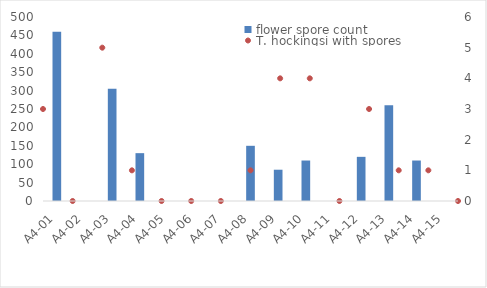
| Category | flower spore count |
|---|---|
| A4-01 | 460 |
| A4-02 | 0 |
| A4-03 | 305 |
| A4-04 | 130 |
| A4-05 | 0 |
| A4-06 | 0 |
| A4-07 | 0 |
| A4-08 | 150 |
| A4-09 | 85 |
| A4-10 | 110 |
| A4-11 | 0 |
| A4-12 | 120 |
| A4-13 | 260 |
| A4-14 | 110 |
| A4-15 | 0 |